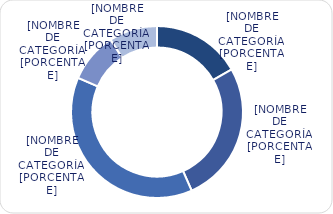
| Category | Series 0 |
|---|---|
| Menores de 3% | 2577.6 |
| Entre 3% y 6% | 4098.1 |
| Entre 6% y 8% | 5861.8 |
| Entre 8% y 9% | 1450.5 |
| Mayores de 9% | 1395.4 |